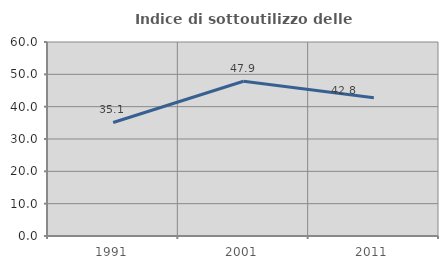
| Category | Indice di sottoutilizzo delle abitazioni  |
|---|---|
| 1991.0 | 35.115 |
| 2001.0 | 47.853 |
| 2011.0 | 42.763 |